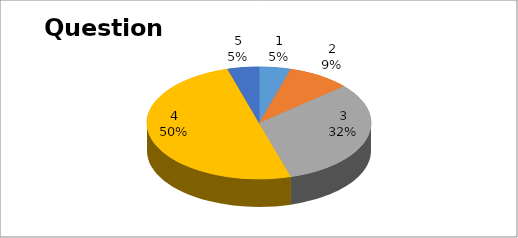
| Category | Series 0 |
|---|---|
| 0 | 1 |
| 1 | 2 |
| 2 | 7 |
| 3 | 11 |
| 4 | 1 |